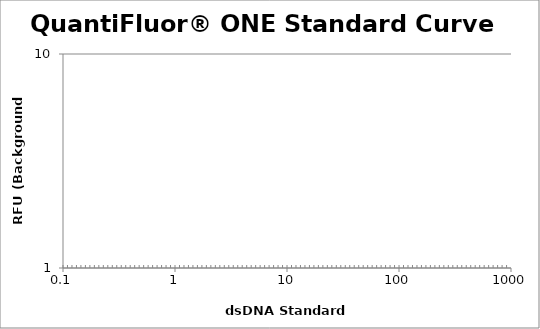
| Category | Average |
|---|---|
| 400.0 | 0 |
| 200.0 | 0 |
| 50.0 | 0 |
| 12.5 | 0 |
| 3.125 | 0 |
| 0.78125 | 0 |
| 0.1953125 | 0 |